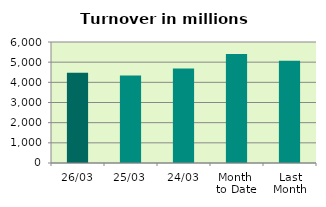
| Category | Series 0 |
|---|---|
| 26/03 | 4471.761 |
| 25/03 | 4343.955 |
| 24/03 | 4686.534 |
| Month 
to Date | 5403.337 |
| Last
Month | 5069.383 |